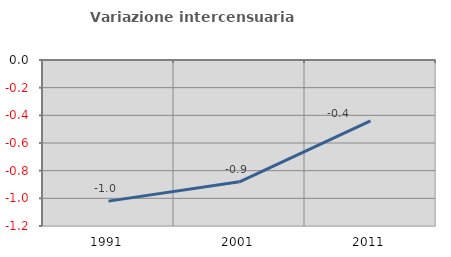
| Category | Variazione intercensuaria annua |
|---|---|
| 1991.0 | -1.02 |
| 2001.0 | -0.88 |
| 2011.0 | -0.441 |